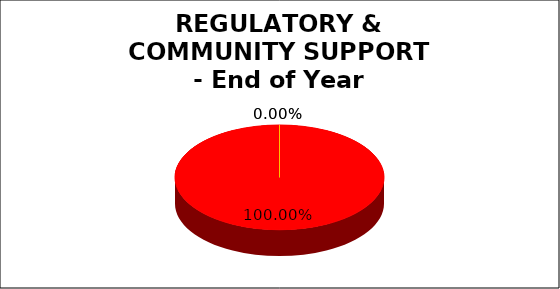
| Category | Q4 |
|---|---|
| Green | 0 |
| Amber | 0 |
| Red | 1 |